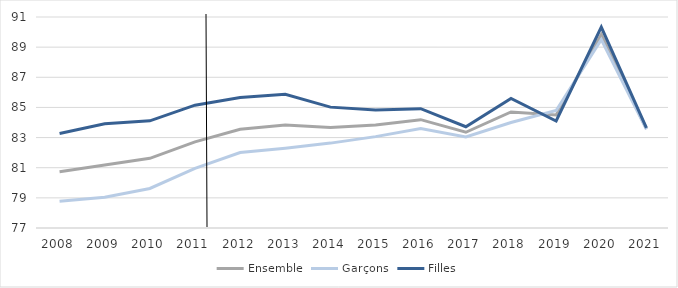
| Category | Ensemble | Garçons | Filles |
|---|---|---|---|
| 2008.0 | 80.734 | 78.772 | 83.267 |
| 2009.0 | 81.187 | 79.035 | 83.912 |
| 2010.0 | 81.622 | 79.621 | 84.109 |
| 2011.0 | 82.716 | 80.953 | 85.151 |
| 2012.0 | 83.548 | 82.011 | 85.664 |
| 2013.0 | 83.838 | 82.293 | 85.868 |
| 2014.0 | 83.664 | 82.633 | 85.02 |
| 2015.0 | 83.841 | 83.062 | 84.823 |
| 2016.0 | 84.188 | 83.601 | 84.917 |
| 2017.0 | 83.352 | 83.044 | 83.721 |
| 2018.0 | 84.7 | 84 | 85.6 |
| 2019.0 | 84.5 | 84.8 | 84.1 |
| 2020.0 | 89.836 | 89.499 | 90.333 |
| 2021.0 | 83.585 | 83.539 | 83.646 |